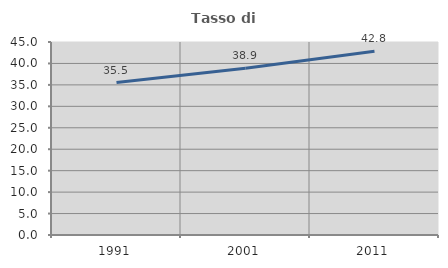
| Category | Tasso di occupazione   |
|---|---|
| 1991.0 | 35.536 |
| 2001.0 | 38.886 |
| 2011.0 | 42.84 |